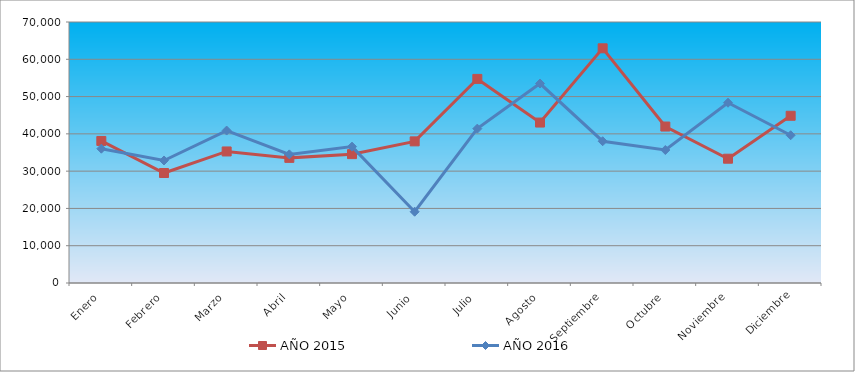
| Category | AÑO 2015 | AÑO 2016 |
|---|---|---|
| Enero | 38100 | 36022.092 |
| Febrero | 29500 | 32859.508 |
| Marzo | 35280 | 40887.368 |
| Abril | 33559.421 | 34499.134 |
| Mayo | 34560.264 | 36574.737 |
| Junio | 37984.269 | 19117.452 |
| Julio | 54739.426 | 41399.646 |
| Agosto | 43031.518 | 53498.69 |
| Septiembre | 62946.525 | 38023.053 |
| Octubre | 41962.573 | 35665.08 |
| Noviembre | 33334.032 | 48347.364 |
| Diciembre | 44848.687 | 39624.517 |